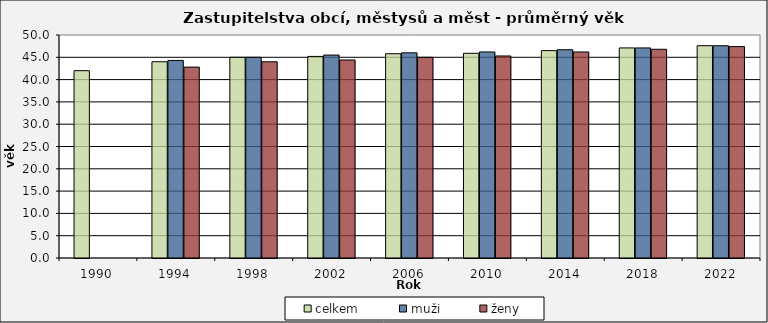
| Category | celkem | muži | ženy |
|---|---|---|---|
| 1990.0 | 42 | 0 | 0 |
| 1994.0 | 44 | 44.3 | 42.8 |
| 1998.0 | 45 | 45 | 44 |
| 2002.0 | 45.2 | 45.5 | 44.4 |
| 2006.0 | 45.8 | 46 | 45 |
| 2010.0 | 45.9 | 46.2 | 45.3 |
| 2014.0 | 46.5 | 46.7 | 46.2 |
| 2018.0 | 47.1 | 47.1 | 46.8 |
| 2022.0 | 47.6 | 47.6 | 47.4 |